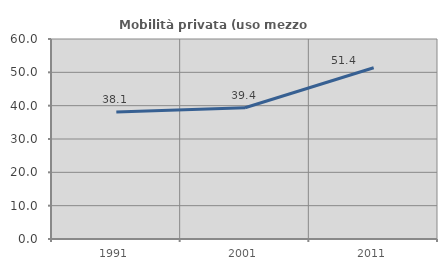
| Category | Mobilità privata (uso mezzo privato) |
|---|---|
| 1991.0 | 38.129 |
| 2001.0 | 39.37 |
| 2011.0 | 51.376 |